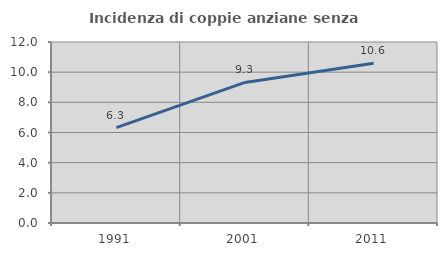
| Category | Incidenza di coppie anziane senza figli  |
|---|---|
| 1991.0 | 6.324 |
| 2001.0 | 9.319 |
| 2011.0 | 10.596 |